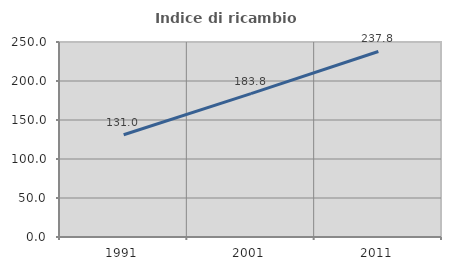
| Category | Indice di ricambio occupazionale  |
|---|---|
| 1991.0 | 131.034 |
| 2001.0 | 183.789 |
| 2011.0 | 237.85 |